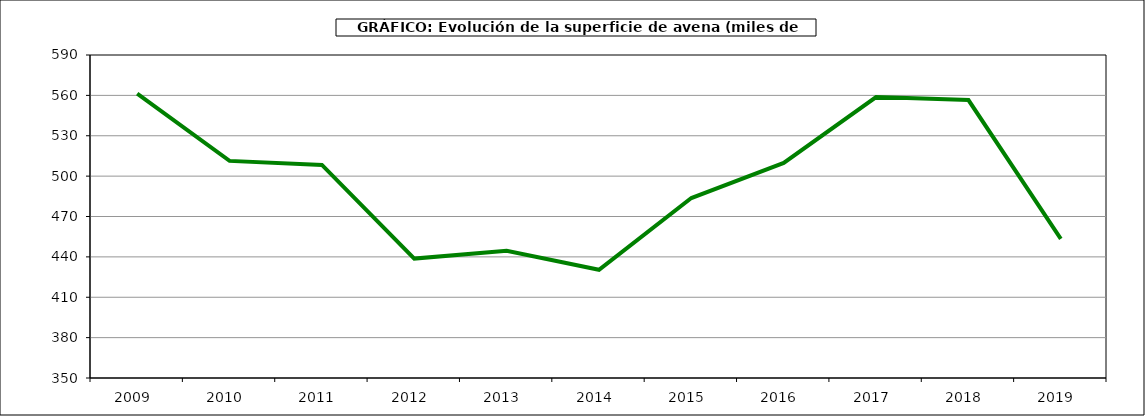
| Category | Superficie |
|---|---|
| 2009.0 | 561.238 |
| 2010.0 | 511.329 |
| 2011.0 | 508.344 |
| 2012.0 | 438.745 |
| 2013.0 | 444.474 |
| 2014.0 | 430.419 |
| 2015.0 | 483.727 |
| 2016.0 | 509.849 |
| 2017.0 | 558.767 |
| 2018.0 | 556.5 |
| 2019.0 | 453.428 |